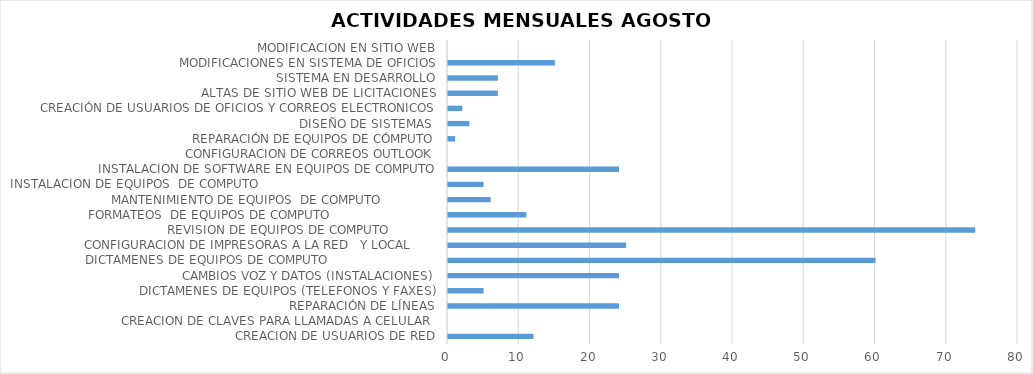
| Category | Series 0 |
|---|---|
| CREACION DE USUARIOS DE RED | 12 |
| CREACION DE CLAVES PARA LLAMADAS A CELULAR  | 0 |
| REPARACIÓN DE LÍNEAS | 24 |
| DICTAMENES DE EQUIPOS (TELEFONOS Y FAXES) | 5 |
| CAMBIOS VOZ Y DATOS (INSTALACIONES) | 24 |
| DICTAMENES DE EQUIPOS DE COMPUTO                             | 60 |
| CONFIGURACION DE IMPRESORAS A LA RED   Y LOCAL       | 25 |
| REVISION DE EQUIPOS DE COMPUTO             | 74 |
| FORMATEOS  DE EQUIPOS DE COMPUTO                            | 11 |
| MANTENIMIENTO DE EQUIPOS  DE COMPUTO               | 6 |
| INSTALACION DE EQUIPOS  DE COMPUTO                                               | 5 |
| INSTALACION DE SOFTWARE EN EQUIPOS DE COMPUTO | 24 |
| CONFIGURACION DE CORREOS OUTLOOK | 0 |
| REPARACIÓN DE EQUIPOS DE CÓMPUTO | 1 |
| DISEÑO DE SISTEMAS  | 3 |
| CREACIÓN DE USUARIOS DE OFICIOS Y CORREOS ELECTRONICOS | 2 |
| ALTAS DE SITIO WEB DE LICITACIONES | 7 |
| SISTEMA EN DESARROLLO | 7 |
| MODIFICACIONES EN SISTEMA DE OFICIOS | 15 |
| MODIFICACION EN SITIO WEB | 0 |